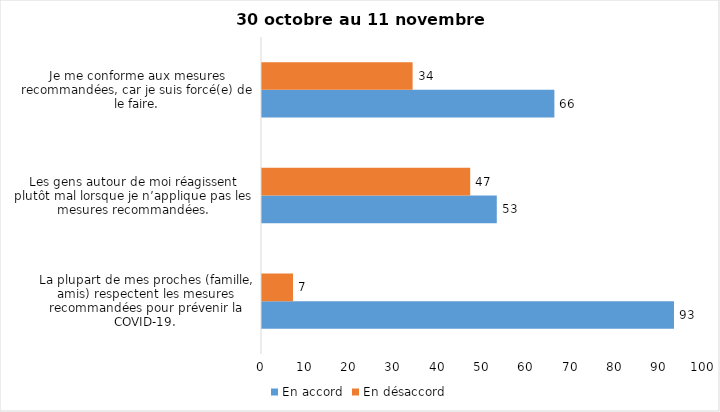
| Category | En accord | En désaccord |
|---|---|---|
| La plupart de mes proches (famille, amis) respectent les mesures recommandées pour prévenir la COVID-19. | 93 | 7 |
| Les gens autour de moi réagissent plutôt mal lorsque je n’applique pas les mesures recommandées. | 53 | 47 |
| Je me conforme aux mesures recommandées, car je suis forcé(e) de le faire. | 66 | 34 |